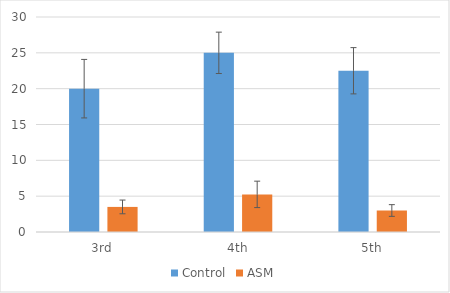
| Category | Control | ASM |
|---|---|---|
| 3rd | 20 | 3.5 |
| 4th | 25 | 5.25 |
| 5th | 22.5 | 3 |